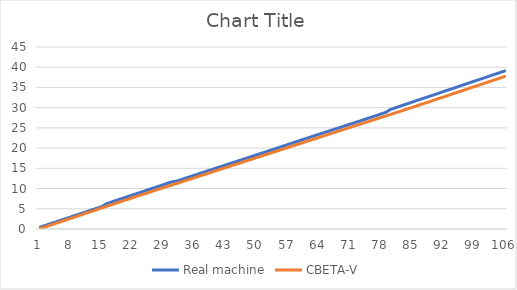
| Category | Real machine | CBETA-V |
|---|---|---|
| 0 | 0.363 | 0.028 |
| 1 | 0.741 | 0.388 |
| 2 | 1.109 | 0.759 |
| 3 | 1.47 | 1.133 |
| 4 | 1.836 | 1.497 |
| 5 | 2.202 | 1.86 |
| 6 | 2.577 | 2.23 |
| 7 | 2.937 | 2.602 |
| 8 | 3.303 | 2.965 |
| 9 | 3.673 | 3.326 |
| 10 | 4.034 | 3.701 |
| 11 | 4.397 | 4.071 |
| 12 | 4.766 | 4.432 |
| 13 | 5.142 | 4.799 |
| 14 | 5.498 | 5.173 |
| 15 | 6.187 | 5.541 |
| 16 | 6.569 | 5.901 |
| 17 | 6.951 | 6.267 |
| 18 | 7.318 | 6.639 |
| 19 | 7.666 | 7.004 |
| 20 | 8.045 | 7.359 |
| 21 | 8.417 | 7.726 |
| 22 | 8.758 | 8.095 |
| 23 | 9.127 | 8.45 |
| 24 | 9.51 | 8.803 |
| 25 | 9.88 | 9.166 |
| 26 | 10.237 | 9.526 |
| 27 | 10.59 | 9.872 |
| 28 | 10.982 | 10.225 |
| 29 | 11.349 | 10.587 |
| 30 | 11.698 | 10.935 |
| 31 | 11.855 | 11.28 |
| 32 | 12.232 | 11.643 |
| 33 | 12.599 | 11.997 |
| 34 | 12.948 | 12.34 |
| 35 | 13.321 | 12.699 |
| 36 | 13.696 | 13.061 |
| 37 | 14.055 | 13.408 |
| 38 | 14.413 | 13.759 |
| 39 | 14.767 | 14.125 |
| 40 | 15.131 | 14.479 |
| 41 | 15.481 | 14.824 |
| 42 | 15.846 | 15.186 |
| 43 | 16.212 | 15.548 |
| 44 | 16.56 | 15.894 |
| 45 | 16.92 | 16.247 |
| 46 | 17.286 | 16.613 |
| 47 | 17.643 | 16.965 |
| 48 | 17.999 | 17.312 |
| 49 | 18.361 | 17.674 |
| 50 | 18.723 | 18.035 |
| 51 | 19.076 | 18.38 |
| 52 | 19.451 | 18.735 |
| 53 | 19.814 | 19.1 |
| 54 | 20.172 | 19.451 |
| 55 | 20.551 | 19.799 |
| 56 | 20.905 | 20.163 |
| 57 | 21.261 | 20.522 |
| 58 | 21.631 | 20.867 |
| 59 | 22.002 | 21.224 |
| 60 | 22.356 | 21.588 |
| 61 | 22.715 | 21.938 |
| 62 | 23.082 | 22.286 |
| 63 | 23.438 | 22.651 |
| 64 | 23.788 | 23.008 |
| 65 | 24.149 | 23.353 |
| 66 | 24.508 | 23.712 |
| 67 | 24.867 | 24.076 |
| 68 | 25.214 | 24.423 |
| 69 | 25.58 | 24.774 |
| 70 | 25.95 | 25.139 |
| 71 | 26.295 | 25.491 |
| 72 | 26.641 | 25.836 |
| 73 | 27.018 | 26.197 |
| 74 | 27.384 | 26.552 |
| 75 | 27.733 | 26.893 |
| 76 | 28.096 | 27.251 |
| 77 | 28.472 | 27.611 |
| 78 | 28.831 | 27.95 |
| 79 | 29.538 | 28.303 |
| 80 | 29.907 | 28.67 |
| 81 | 30.281 | 29.019 |
| 82 | 30.657 | 29.372 |
| 83 | 31.017 | 29.74 |
| 84 | 31.394 | 30.092 |
| 85 | 31.791 | 30.455 |
| 86 | 32.134 | 30.836 |
| 87 | 32.505 | 31.186 |
| 88 | 32.874 | 31.537 |
| 89 | 33.244 | 31.929 |
| 90 | 33.614 | 32.301 |
| 91 | 33.986 | 32.638 |
| 92 | 34.355 | 33.01 |
| 93 | 34.725 | 33.402 |
| 94 | 35.101 | 33.766 |
| 95 | 35.473 | 34.105 |
| 96 | 35.841 | 34.485 |
| 97 | 36.209 | 34.877 |
| 98 | 36.586 | 35.228 |
| 99 | 36.952 | 35.574 |
| 100 | 37.316 | 35.961 |
| 101 | 37.685 | 36.345 |
| 102 | 38.067 | 36.688 |
| 103 | 38.434 | 37.045 |
| 104 | 38.796 | 37.436 |
| 105 | 39.174 | 37.815 |